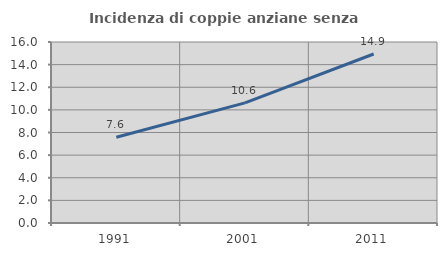
| Category | Incidenza di coppie anziane senza figli  |
|---|---|
| 1991.0 | 7.58 |
| 2001.0 | 10.615 |
| 2011.0 | 14.938 |